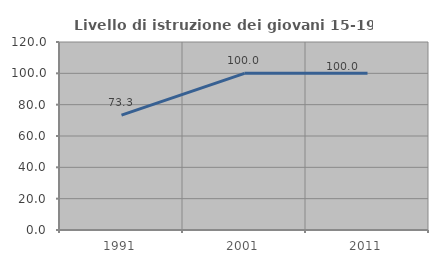
| Category | Livello di istruzione dei giovani 15-19 anni |
|---|---|
| 1991.0 | 73.333 |
| 2001.0 | 100 |
| 2011.0 | 100 |